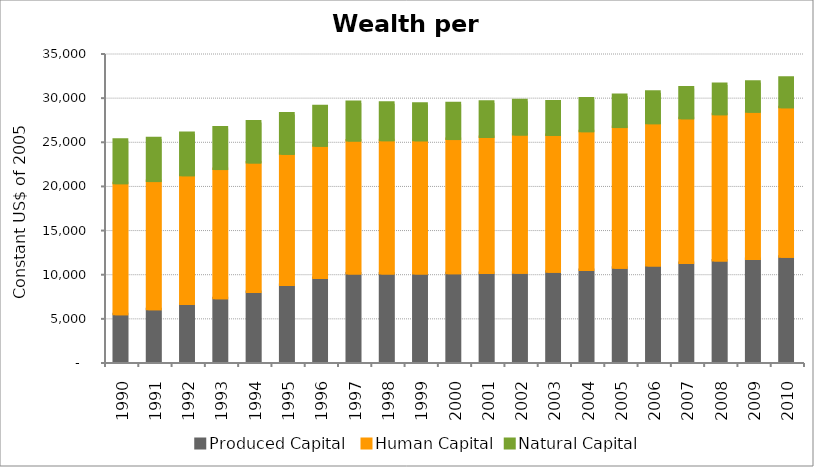
| Category | Produced Capital  | Human Capital | Natural Capital |
|---|---|---|---|
| 1990.0 | 5399.593 | 14853.449 | 4926.143 |
| 1991.0 | 5963.848 | 14525.899 | 4856.975 |
| 1992.0 | 6560.319 | 14591.952 | 4778.481 |
| 1993.0 | 7210.533 | 14641.729 | 4706.467 |
| 1994.0 | 7930.117 | 14676.721 | 4633.33 |
| 1995.0 | 8716.423 | 14858.607 | 4570.094 |
| 1996.0 | 9523.312 | 14968.845 | 4467.856 |
| 1997.0 | 10015.357 | 15070.284 | 4353.482 |
| 1998.0 | 10037.528 | 15085.124 | 4239.874 |
| 1999.0 | 10033.064 | 15076.333 | 4150.894 |
| 2000.0 | 10052.169 | 15198.781 | 4052.209 |
| 2001.0 | 10071.771 | 15424.266 | 3968.38 |
| 2002.0 | 10120.051 | 15643.71 | 3875.787 |
| 2003.0 | 10230.398 | 15492.888 | 3782.999 |
| 2004.0 | 10416.495 | 15728.087 | 3702.665 |
| 2005.0 | 10668.28 | 15941.818 | 3626.439 |
| 2006.0 | 10940.388 | 16108.832 | 3554.933 |
| 2007.0 | 11214.845 | 16388.535 | 3485.602 |
| 2008.0 | 11488.291 | 16576.481 | 3425.852 |
| 2009.0 | 11676.633 | 16677.536 | 3403.049 |
| 2010.0 | 11922.717 | 16929.627 | 3337.501 |